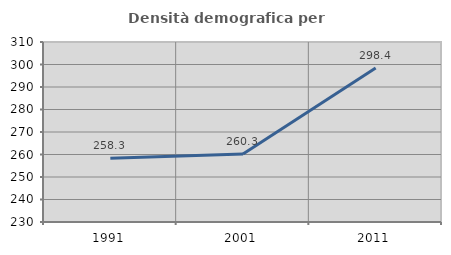
| Category | Densità demografica |
|---|---|
| 1991.0 | 258.315 |
| 2001.0 | 260.259 |
| 2011.0 | 298.413 |